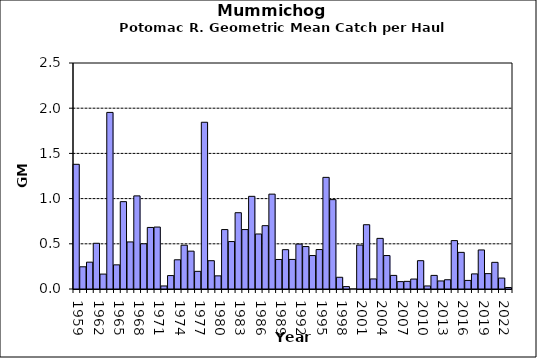
| Category | Series 0 |
|---|---|
| 1959.0 | 1.379 |
| 1960.0 | 0.246 |
| 1961.0 | 0.297 |
| 1962.0 | 0.506 |
| 1963.0 | 0.165 |
| 1964.0 | 1.953 |
| 1965.0 | 0.267 |
| 1966.0 | 0.966 |
| 1967.0 | 0.521 |
| 1968.0 | 1.03 |
| 1969.0 | 0.5 |
| 1970.0 | 0.681 |
| 1971.0 | 0.685 |
| 1972.0 | 0.034 |
| 1973.0 | 0.149 |
| 1974.0 | 0.323 |
| 1975.0 | 0.485 |
| 1976.0 | 0.419 |
| 1977.0 | 0.195 |
| 1978.0 | 1.844 |
| 1979.0 | 0.313 |
| 1980.0 | 0.145 |
| 1981.0 | 0.657 |
| 1982.0 | 0.525 |
| 1983.0 | 0.844 |
| 1984.0 | 0.658 |
| 1985.0 | 1.025 |
| 1986.0 | 0.609 |
| 1987.0 | 0.701 |
| 1988.0 | 1.049 |
| 1989.0 | 0.327 |
| 1990.0 | 0.435 |
| 1991.0 | 0.327 |
| 1992.0 | 0.497 |
| 1993.0 | 0.47 |
| 1994.0 | 0.37 |
| 1995.0 | 0.436 |
| 1996.0 | 1.235 |
| 1997.0 | 0.988 |
| 1998.0 | 0.13 |
| 1999.0 | 0.027 |
| 2000.0 | 0 |
| 2001.0 | 0.486 |
| 2002.0 | 0.711 |
| 2003.0 | 0.111 |
| 2004.0 | 0.56 |
| 2005.0 | 0.37 |
| 2006.0 | 0.15 |
| 2007.0 | 0.082 |
| 2008.0 | 0.084 |
| 2009.0 | 0.11 |
| 2010.0 | 0.313 |
| 2011.0 | 0.034 |
| 2012.0 | 0.15 |
| 2013.0 | 0.089 |
| 2014.0 | 0.102 |
| 2015.0 | 0.535 |
| 2016.0 | 0.405 |
| 2017.0 | 0.095 |
| 2018.0 | 0.167 |
| 2019.0 | 0.432 |
| 2020.0 | 0.17 |
| 2021.0 | 0.295 |
| 2022.0 | 0.121 |
| 2023.0 | 0.017 |